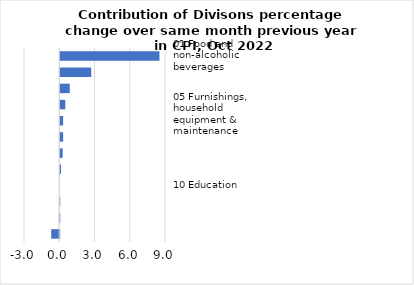
| Category |     Contributions |
|---|---|
| 01 Food and non-alcoholic beverages | 8.441 |
| 07 Transport | 2.637 |
| 08 Communication | 0.811 |
| 11 Restaurants and hotels | 0.43 |
| 05 Furnishings, household equipment & maintenance | 0.245 |
| 02 Alcoholic beverages, tobacco & narcotics | 0.244 |
| 12 Miscellaneous goods & services | 0.206 |
| 03 Clothing and footwear | 0.067 |
| 10 Education | 0 |
| 09 Recreation and culture | -0.002 |
| 06 Health | -0.033 |
| 04 Housing, water, electricity, gas & other fuels | -0.685 |